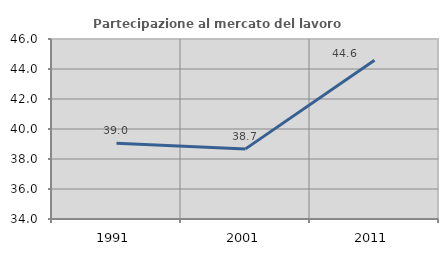
| Category | Partecipazione al mercato del lavoro  femminile |
|---|---|
| 1991.0 | 39.045 |
| 2001.0 | 38.675 |
| 2011.0 | 44.588 |